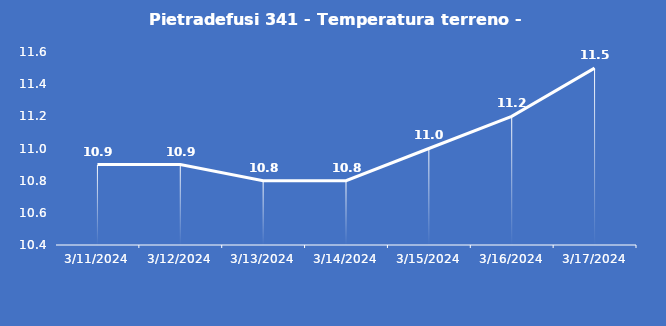
| Category | Pietradefusi 341 - Temperatura terreno - Grezzo (°C) |
|---|---|
| 3/11/24 | 10.9 |
| 3/12/24 | 10.9 |
| 3/13/24 | 10.8 |
| 3/14/24 | 10.8 |
| 3/15/24 | 11 |
| 3/16/24 | 11.2 |
| 3/17/24 | 11.5 |